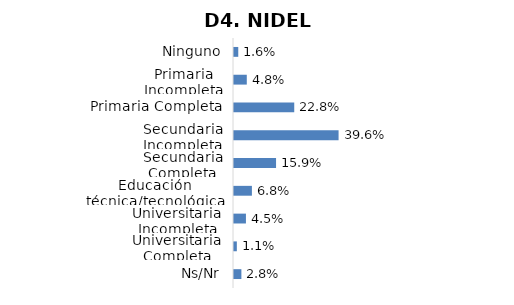
| Category | Series 0 |
|---|---|
| Ninguno | 0.016 |
| Primaria Incompleta | 0.048 |
| Primaria Completa | 0.228 |
| Secundaria Incompleta | 0.396 |
| Secundaria Completa | 0.159 |
| Educación técnica/tecnológica | 0.068 |
| Universitaria Incompleta | 0.045 |
| Universitaria Completa | 0.011 |
| Ns/Nr | 0.028 |